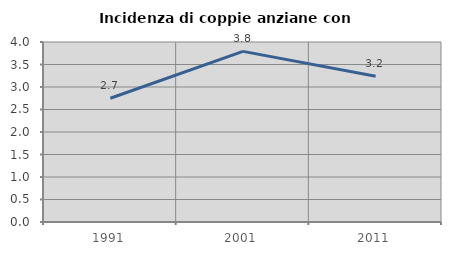
| Category | Incidenza di coppie anziane con figli |
|---|---|
| 1991.0 | 2.75 |
| 2001.0 | 3.792 |
| 2011.0 | 3.238 |